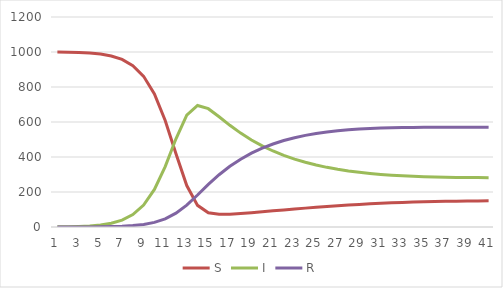
| Category | S | I | R |
|---|---|---|---|
| 0 | 1000 | 1 | 0 |
| 1 | 999.05 | 1.85 | 0.1 |
| 2 | 997.299 | 3.421 | 0.28 |
| 3 | 994.073 | 6.319 | 0.608 |
| 4 | 988.137 | 11.653 | 1.21 |
| 5 | 977.266 | 21.42 | 2.314 |
| 6 | 957.52 | 39.14 | 4.341 |
| 7 | 922.217 | 70.745 | 8.038 |
| 8 | 860.913 | 125.376 | 14.71 |
| 9 | 759.98 | 214.508 | 26.512 |
| 10 | 609.009 | 345.353 | 46.638 |
| 11 | 418.285 | 503.874 | 78.841 |
| 12 | 236.658 | 639.056 | 125.286 |
| 13 | 123.637 | 694.435 | 182.928 |
| 14 | 81.647 | 676.128 | 243.225 |
| 15 | 72.411 | 629.913 | 298.676 |
| 16 | 73.228 | 581.038 | 346.734 |
| 17 | 77.068 | 536.431 | 387.501 |
| 18 | 81.923 | 497.308 | 421.769 |
| 19 | 87.136 | 463.453 | 450.411 |
| 20 | 92.446 | 434.318 | 474.236 |
| 21 | 97.723 | 409.321 | 493.956 |
| 22 | 102.887 | 387.923 | 510.19 |
| 23 | 107.88 | 369.647 | 523.473 |
| 24 | 112.659 | 354.077 | 534.264 |
| 25 | 117.186 | 340.855 | 542.959 |
| 26 | 121.433 | 329.671 | 549.896 |
| 27 | 125.379 | 320.253 | 555.369 |
| 28 | 129.007 | 312.368 | 559.625 |
| 29 | 132.309 | 305.81 | 562.881 |
| 30 | 135.282 | 300.4 | 565.318 |
| 31 | 137.929 | 295.979 | 567.092 |
| 32 | 140.259 | 292.406 | 568.335 |
| 33 | 142.283 | 289.558 | 569.159 |
| 34 | 144.02 | 287.323 | 569.657 |
| 35 | 145.489 | 285.605 | 569.906 |
| 36 | 146.712 | 284.316 | 569.972 |
| 37 | 147.714 | 283.382 | 569.905 |
| 38 | 148.519 | 282.734 | 569.748 |
| 39 | 149.151 | 282.315 | 569.534 |
| 40 | 149.636 | 282.075 | 569.288 |